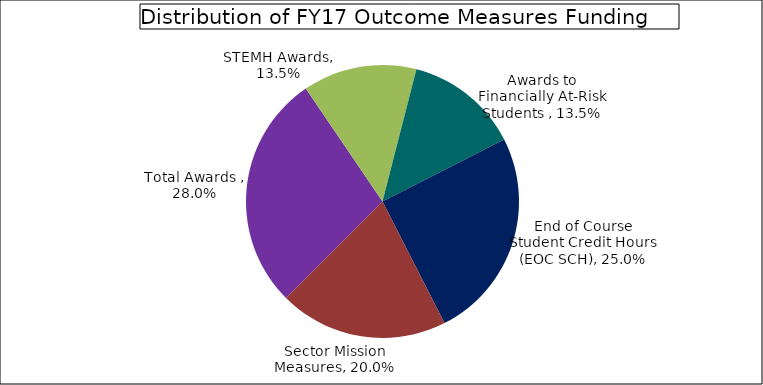
| Category | Series 0 |
|---|---|
| Total Awards  | 0.28 |
| STEMH Awards | 0.135 |
| Awards to Financially At-Risk Students  | 0.135 |
| End of Course Student Credit Hours (EOC SCH) | 0.25 |
| Sector Mission Measures | 0.2 |